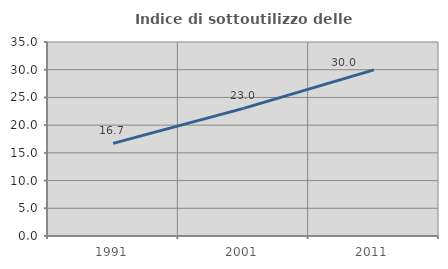
| Category | Indice di sottoutilizzo delle abitazioni  |
|---|---|
| 1991.0 | 16.705 |
| 2001.0 | 23.026 |
| 2011.0 | 29.968 |